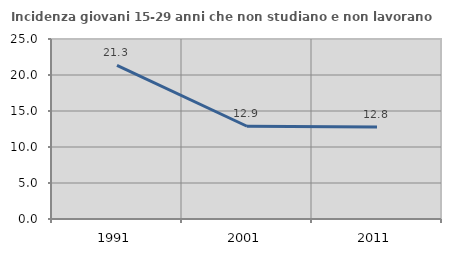
| Category | Incidenza giovani 15-29 anni che non studiano e non lavorano  |
|---|---|
| 1991.0 | 21.344 |
| 2001.0 | 12.882 |
| 2011.0 | 12.773 |